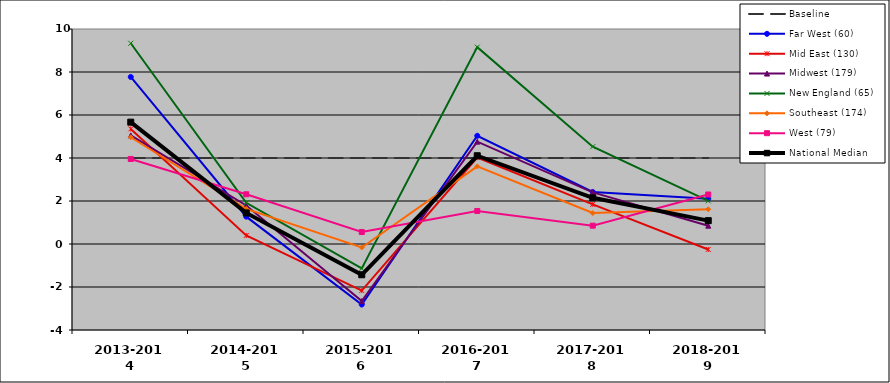
| Category | Baseline | Far West (60) | Mid East (130) | Midwest (179) | New England (65) | Southeast (174) | West (79) | National Median |
|---|---|---|---|---|---|---|---|---|
| 2013-2014 | 4 | 7.77 | 5.351 | 5.052 | 9.338 | 4.965 | 3.955 | 5.667 |
| 2014-2015 | 4 | 1.271 | 0.396 | 1.791 | 1.915 | 1.634 | 2.312 | 1.445 |
| 2015-2016 | 4 | -2.816 | -2.166 | -2.654 | -1.136 | -0.162 | 0.557 | -1.431 |
| 2016-2017 | 4 | 5.033 | 4.02 | 4.761 | 9.157 | 3.608 | 1.537 | 4.105 |
| 2017-2018 | 4 | 2.42 | 1.843 | 2.401 | 4.528 | 1.44 | 0.852 | 2.148 |
| 2018-2019 | 4 | 2.103 | -0.254 | 0.852 | 2.004 | 1.616 | 2.303 | 1.087 |